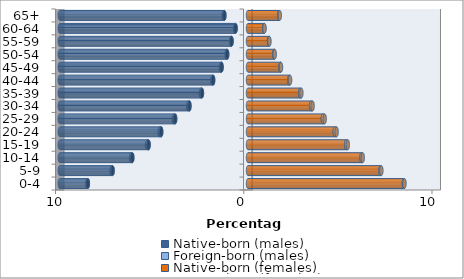
| Category | Native-born (males) | Foreign-born (males) | Native-born (females) | Foreign-born (females) |
|---|---|---|---|---|
| 0-4 | -8.508 | -0.03 | 8.279 | 0.033 |
| 5-9 | -7.194 | -0.052 | 7.037 | 0.047 |
| 10-14 | -6.147 | -0.066 | 6.029 | 0.068 |
| 15-19 | -5.283 | -0.081 | 5.214 | 0.088 |
| 20-24 | -4.611 | -0.084 | 4.609 | 0.1 |
| 25-29 | -3.87 | -0.078 | 3.976 | 0.099 |
| 30-34 | -3.111 | -0.068 | 3.349 | 0.083 |
| 35-39 | -2.447 | -0.058 | 2.77 | 0.065 |
| 40-44 | -1.852 | -0.045 | 2.19 | 0.046 |
| 45-49 | -1.404 | -0.039 | 1.72 | 0.034 |
| 50-54 | -1.107 | -0.031 | 1.392 | 0.025 |
| 55-59 | -0.872 | -0.028 | 1.117 | 0.021 |
| 60-64 | -0.66 | -0.025 | 0.859 | 0.018 |
| 65+ | -1.256 | -0.039 | 1.657 | 0.03 |